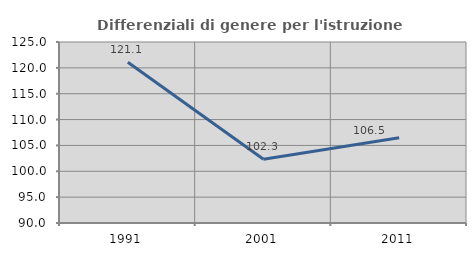
| Category | Differenziali di genere per l'istruzione superiore |
|---|---|
| 1991.0 | 121.097 |
| 2001.0 | 102.33 |
| 2011.0 | 106.489 |